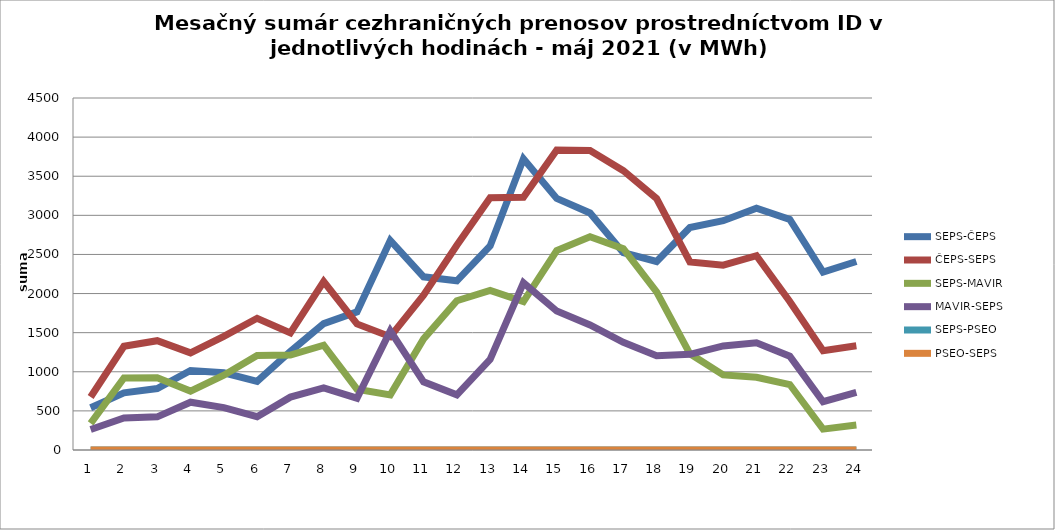
| Category | SEPS-ČEPS | ČEPS-SEPS | SEPS-MAVIR | MAVIR-SEPS | SEPS-PSEO | PSEO-SEPS |
|---|---|---|---|---|---|---|
| 1.0 | 541 | 678 | 340 | 262 | 0 | 0 |
| 2.0 | 730 | 1326 | 922 | 409 | 0 | 0 |
| 3.0 | 786 | 1397 | 924 | 424 | 0 | 0 |
| 4.0 | 1016 | 1242 | 753 | 611 | 0 | 0 |
| 5.0 | 987 | 1452 | 956 | 542 | 0 | 0 |
| 6.0 | 877 | 1684 | 1209 | 426 | 0 | 0 |
| 7.0 | 1259 | 1497 | 1213 | 676 | 0 | 0 |
| 8.0 | 1615 | 2153 | 1340 | 793 | 0 | 0 |
| 9.0 | 1766 | 1612 | 777 | 662 | 0 | 0 |
| 10.0 | 2679 | 1449 | 705 | 1523 | 0 | 0 |
| 11.0 | 2214 | 1978 | 1420 | 871 | 0 | 0 |
| 12.0 | 2163 | 2617 | 1908 | 706 | 0 | 0 |
| 13.0 | 2609 | 3224 | 2039 | 1158 | 0 | 0 |
| 14.0 | 3723 | 3231 | 1896 | 2138 | 0 | 0 |
| 15.0 | 3216 | 3835 | 2549 | 1776 | 0 | 0 |
| 16.0 | 3030 | 3830 | 2727 | 1599 | 0 | 0 |
| 17.0 | 2523 | 3571 | 2573 | 1376 | 0 | 0 |
| 18.0 | 2410 | 3215 | 2021 | 1206 | 0 | 0 |
| 19.0 | 2844 | 2405 | 1230 | 1223 | 0 | 0 |
| 20.0 | 2932 | 2363 | 960 | 1330 | 0 | 0 |
| 21.0 | 3092 | 2484 | 929 | 1370 | 0 | 0 |
| 22.0 | 2947 | 1899 | 837 | 1200 | 0 | 0 |
| 23.0 | 2273 | 1268 | 267 | 617 | 0 | 0 |
| 24.0 | 2410 | 1333 | 320 | 736 | 0 | 0 |